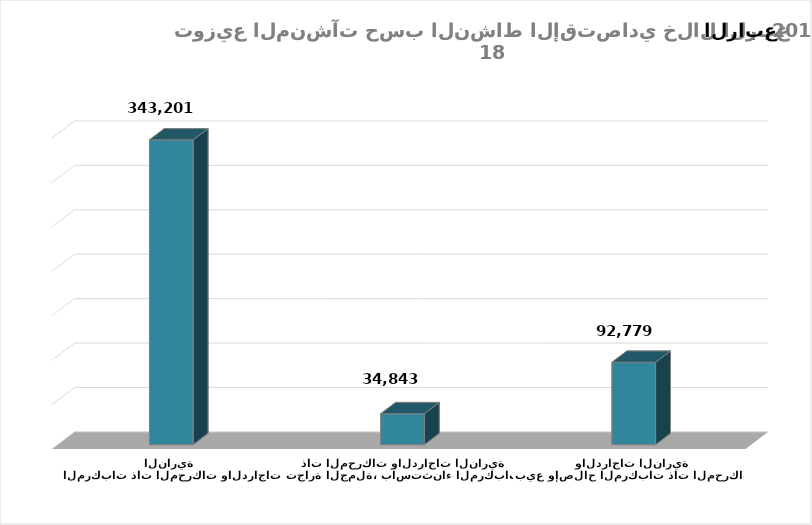
| Category | عدد المنشآت |
|---|---|
| بيع وإصلاح المركبات ذات المحركات والدراجات النارية | 92779 |
| تجارة الجملة، باستثناء المركبات ذات المحركات والدراجات النارية | 34843 |
| تجارة التجزئة، باستثناء المركبات ذات المحركات والدراجات النارية | 343201 |